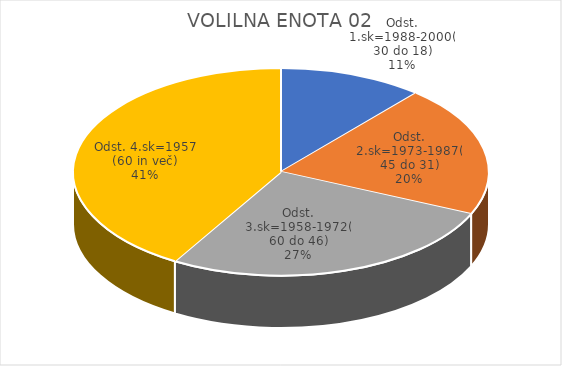
| Category | VOLILNA ENOTA 02 |
|---|---|
| Odst. 1.sk=1988-2000(30 do 18) | 5.49 |
| Odst. 2.sk=1973-1987(45 do 31) | 9.94 |
| Odst. 3.sk=1958-1972(60 do 46) | 13.09 |
| Odst. 4.sk=1957 (60 in več) | 20.22 |